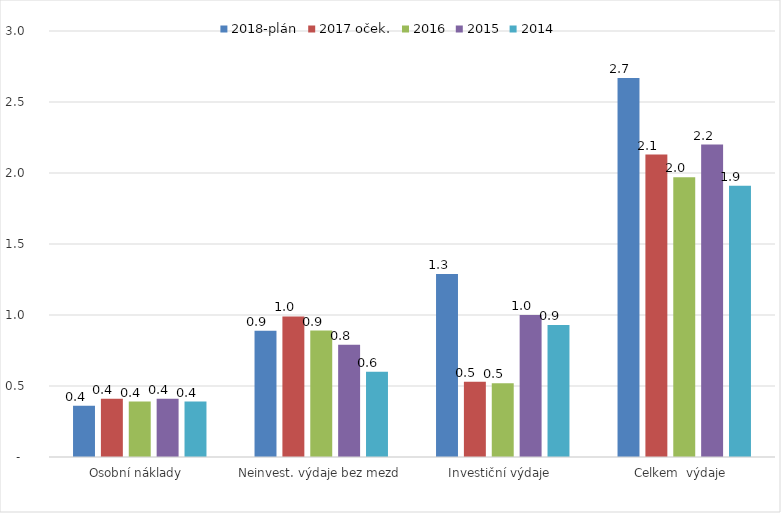
| Category | 2018-plán | 2017 oček. | 2016 | 2015 | 2014 |
|---|---|---|---|---|---|
| Osobní náklady  | 0.361 | 0.41 | 0.39 | 0.41 | 0.39 |
| Neinvest. výdaje bez mezd | 0.889 | 0.99 | 0.89 | 0.79 | 0.6 |
| Investiční výdaje  | 1.288 | 0.53 | 0.52 | 1 | 0.93 |
| Celkem  výdaje  | 2.67 | 2.13 | 1.97 | 2.2 | 1.91 |